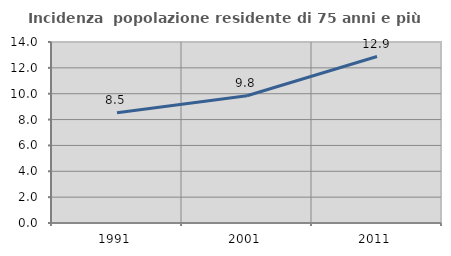
| Category | Incidenza  popolazione residente di 75 anni e più |
|---|---|
| 1991.0 | 8.525 |
| 2001.0 | 9.841 |
| 2011.0 | 12.878 |